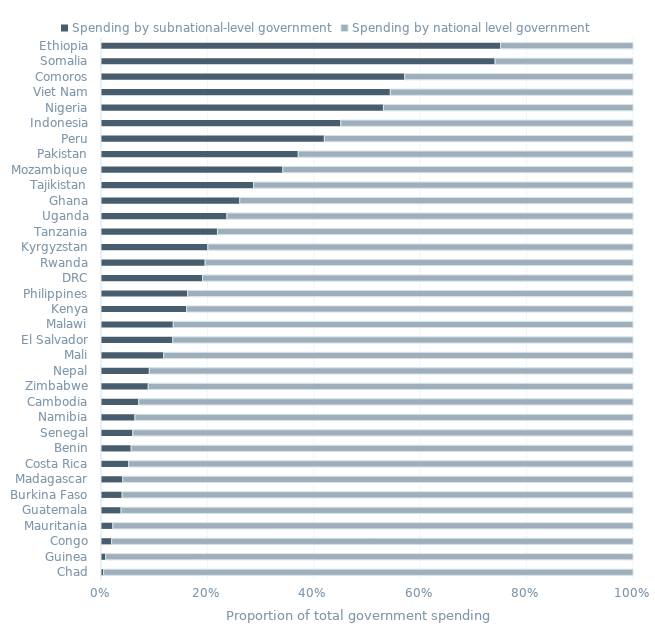
| Category | Spending by subnational-level government | Spending by national level government |
|---|---|---|
| Chad | 0.004 | 0.996 |
| Guinea | 0.008 | 0.992 |
| Congo | 0.019 | 0.981 |
| Mauritania | 0.021 | 0.979 |
| Guatemala | 0.037 | 0.963 |
| Burkina Faso | 0.039 | 0.961 |
| Madagascar | 0.04 | 0.96 |
| Costa Rica | 0.051 | 0.949 |
| Benin | 0.056 | 0.944 |
| Senegal | 0.059 | 0.941 |
| Namibia | 0.063 | 0.937 |
| Cambodia | 0.07 | 0.93 |
| Zimbabwe | 0.088 | 0.912 |
| Nepal | 0.09 | 0.91 |
| Mali | 0.117 | 0.883 |
| El Salvador | 0.134 | 0.866 |
| Malawi | 0.135 | 0.865 |
| Kenya | 0.16 | 0.84 |
| Philippines | 0.162 | 0.838 |
| DRC | 0.19 | 0.81 |
| Rwanda | 0.195 | 0.805 |
| Kyrgyzstan | 0.2 | 0.8 |
| Tanzania | 0.218 | 0.782 |
| Uganda | 0.236 | 0.764 |
| Ghana | 0.26 | 0.74 |
| Tajikistan | 0.286 | 0.714 |
| Mozambique | 0.341 | 0.659 |
| Pakistan | 0.37 | 0.63 |
| Peru | 0.419 | 0.581 |
| Indonesia | 0.45 | 0.55 |
| Nigeria | 0.53 | 0.47 |
| Viet Nam | 0.543 | 0.457 |
| Comoros | 0.57 | 0.43 |
| Somalia | 0.74 | 0.26 |
| Ethiopia | 0.75 | 0.25 |